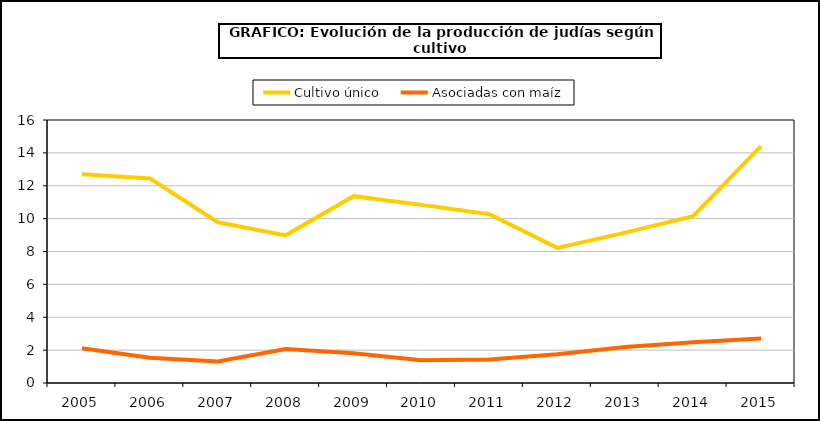
| Category | Cultivo único | Asociadas con maíz |
|---|---|---|
| 2005.0 | 12.704 | 2.111 |
| 2006.0 | 12.447 | 1.536 |
| 2007.0 | 9.779 | 1.306 |
| 2008.0 | 8.983 | 2.065 |
| 2009.0 | 11.367 | 1.808 |
| 2010.0 | 10.837 | 1.389 |
| 2011.0 | 10.269 | 1.432 |
| 2012.0 | 8.22 | 1.751 |
| 2013.0 | 9.15 | 2.187 |
| 2014.0 | 10.155 | 2.474 |
| 2015.0 | 14.413 | 2.712 |